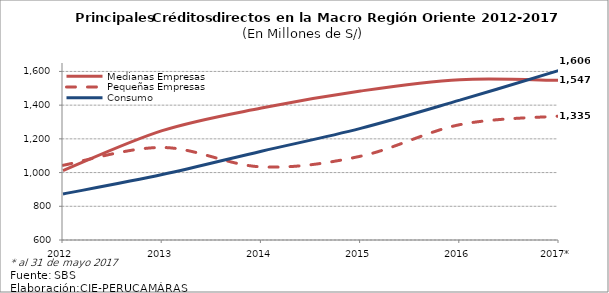
| Category | Medianas Empresas | Pequeñas Empresas | Consumo |
|---|---|---|---|
| 2012 | 1011.6 | 1043.132 | 872.705 |
| 2013 | 1248.452 | 1148.939 | 988.045 |
| 2014 | 1382.697 | 1033.77 | 1126.733 |
| 2015 | 1483.807 | 1097.088 | 1262.312 |
| 2016 | 1550.945 | 1284.228 | 1429.566 |
| 2017* | 1547.007 | 1335.212 | 1605.824 |